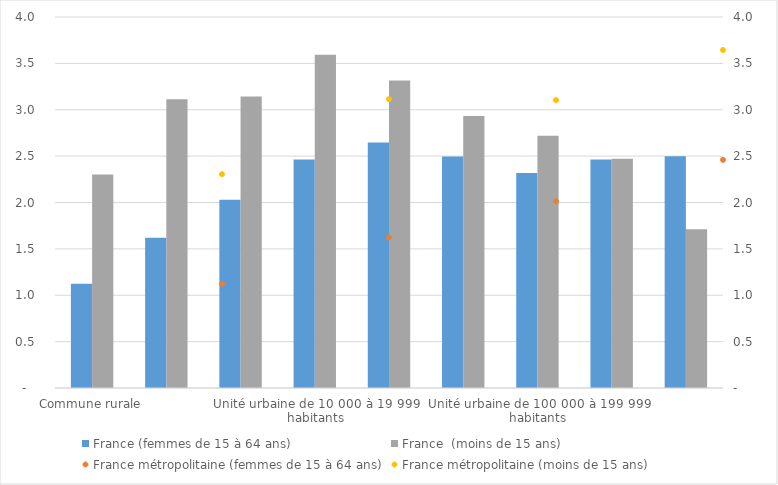
| Category | France (femmes de 15 à 64 ans) | France  (moins de 15 ans) |
|---|---|---|
| Commune rurale | 1.125 | 2.301 |
| Unité urbaine de 2 000 à 4 999 habitants | 1.621 | 3.113 |
| Unité urbaine de 5 000 à 9 999 habitants | 2.03 | 3.142 |
| Unité urbaine de 10 000 à 19 999 habitants | 2.462 | 3.594 |
| Unité urbaine de 20 000 à 49 999 habitants | 2.647 | 3.316 |
| Unité urbaine de 50 000 à 99 999 habitants | 2.496 | 2.932 |
| Unité urbaine de 100 000 à 199 999 habitants | 2.319 | 2.721 |
| Unité urbaine de 200 000 à 1 999 999 habitants | 2.463 | 2.472 |
| Unité urbaine de Paris | 2.499 | 1.713 |